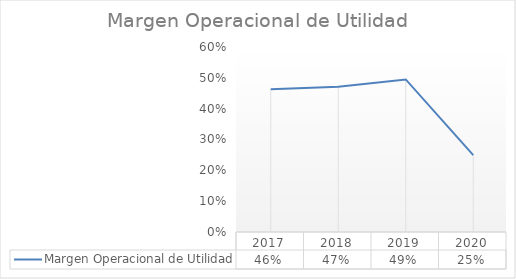
| Category | Margen Operacional de Utilidad |
|---|---|
| 2017.0 | 0.463 |
| 2018.0 | 0.471 |
| 2019.0 | 0.495 |
| 2020.0 | 0.249 |